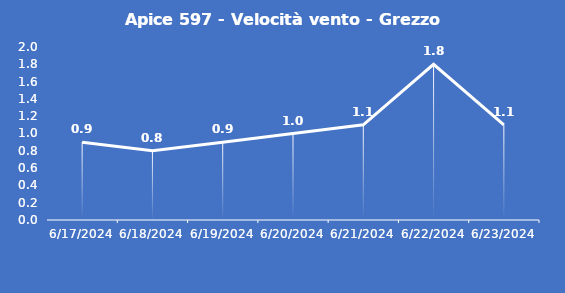
| Category | Apice 597 - Velocità vento - Grezzo (m/s) |
|---|---|
| 6/17/24 | 0.9 |
| 6/18/24 | 0.8 |
| 6/19/24 | 0.9 |
| 6/20/24 | 1 |
| 6/21/24 | 1.1 |
| 6/22/24 | 1.8 |
| 6/23/24 | 1.1 |